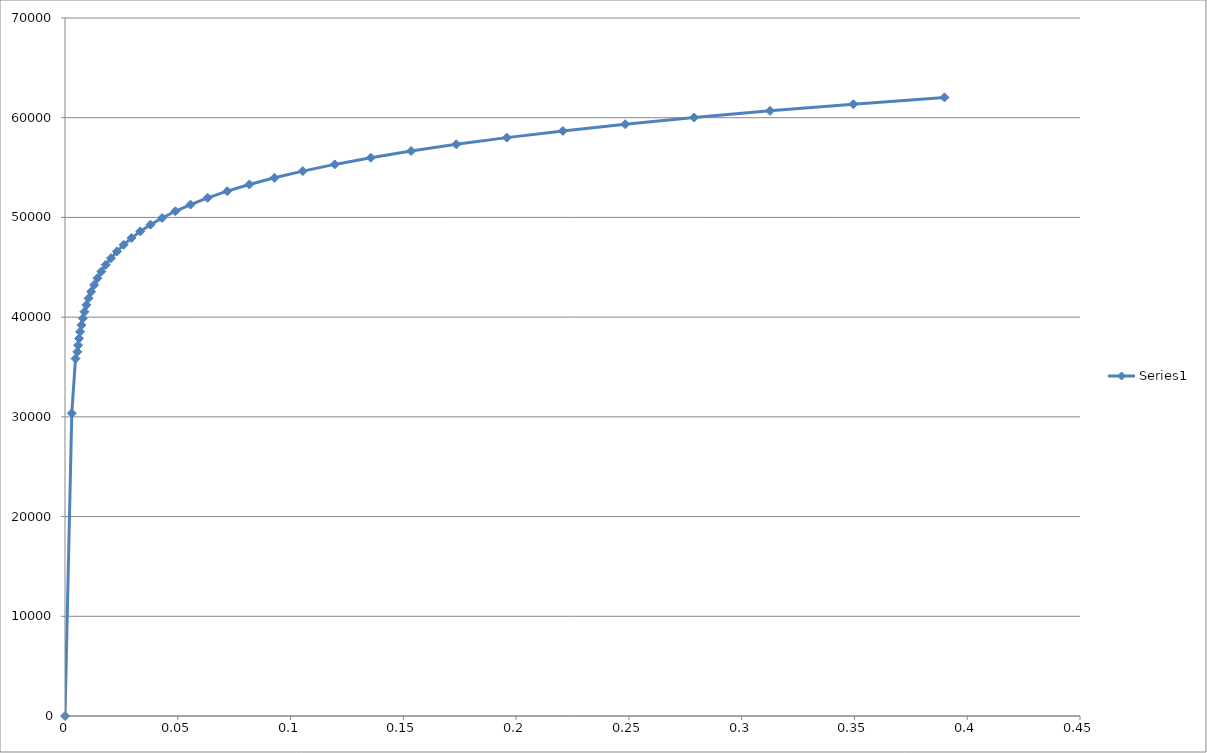
| Category | Series 0 |
|---|---|
| 0.0 | 0 |
| 0.003005925669186085 | 30359.849 |
| 0.004664786749392702 | 35844.739 |
| 0.005452339483985734 | 36516.21 |
| 0.005811254365794077 | 37187.681 |
| 0.00622561479454806 | 37859.153 |
| 0.006704050499563345 | 38530.624 |
| 0.007256472028414306 | 39202.095 |
| 0.00789424973801895 | 39873.567 |
| 0.008630415587952998 | 40545.038 |
| 0.009479890126493886 | 41216.509 |
| 0.010459737169440996 | 41887.981 |
| 0.011589448738592958 | 42559.452 |
| 0.01289126283115271 | 43230.923 |
| 0.014390516507908062 | 43902.395 |
| 0.016116036584933827 | 44573.866 |
| 0.018100569851106543 | 45245.337 |
| 0.020381254163562037 | 45916.809 |
| 0.023000130937359708 | 46588.28 |
| 0.026004698376118084 | 47259.752 |
| 0.029448503209782928 | 47931.223 |
| 0.033391766628700026 | 48602.694 |
| 0.037902037440338855 | 49274.166 |
| 0.043054862139186634 | 49945.637 |
| 0.04893445749660048 | 50617.108 |
| 0.055634366398208034 | 51288.58 |
| 0.06325807198181446 | 51960.051 |
| 0.0719195387335889 | 52631.522 |
| 0.08174364226691593 | 53302.994 |
| 0.09286644236453725 | 53974.465 |
| 0.1054352470218876 | 54645.936 |
| 0.1196084094156904 | 55317.408 |
| 0.13555479589750502 | 55988.879 |
| 0.15345286245630915 | 56660.35 |
| 0.17348928094471827 | 57331.822 |
| 0.19585706609033848 | 58003.293 |
| 0.22075317112083429 | 58674.764 |
| 0.24837554448147492 | 59346.236 |
| 0.2789196726142133 | 60017.707 |
| 0.31257467300104635 | 60689.178 |
| 0.34951904521342375 | 61360.65 |
| 0.3899162317033232 | 62032.121 |